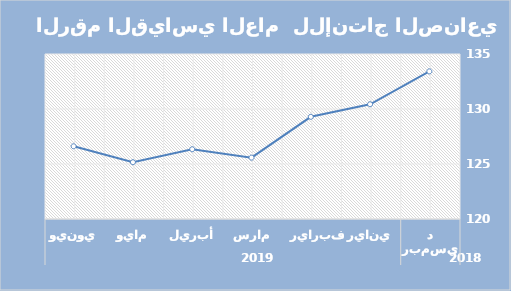
| Category | Series 0 |
|---|---|
| 0 | 133.42 |
| 1 | 130.43 |
| 2 | 129.29 |
| 3 | 125.58 |
| 4 | 126.34 |
| 5 | 125.16 |
| 6 | 126.61 |